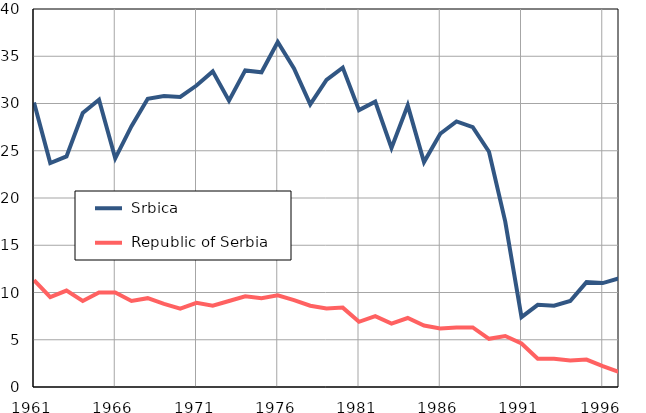
| Category |  Srbica |  Republic of Serbia |
|---|---|---|
| 1961.0 | 30.1 | 11.3 |
| 1962.0 | 23.7 | 9.5 |
| 1963.0 | 24.4 | 10.2 |
| 1964.0 | 29 | 9.1 |
| 1965.0 | 30.4 | 10 |
| 1966.0 | 24.2 | 10 |
| 1967.0 | 27.6 | 9.1 |
| 1968.0 | 30.5 | 9.4 |
| 1969.0 | 30.8 | 8.8 |
| 1970.0 | 30.7 | 8.3 |
| 1971.0 | 31.9 | 8.9 |
| 1972.0 | 33.4 | 8.6 |
| 1973.0 | 30.3 | 9.1 |
| 1974.0 | 33.5 | 9.6 |
| 1975.0 | 33.3 | 9.4 |
| 1976.0 | 36.5 | 9.7 |
| 1977.0 | 33.7 | 9.2 |
| 1978.0 | 29.9 | 8.6 |
| 1979.0 | 32.5 | 8.3 |
| 1980.0 | 33.8 | 8.4 |
| 1981.0 | 29.3 | 6.9 |
| 1982.0 | 30.2 | 7.5 |
| 1983.0 | 25.3 | 6.7 |
| 1984.0 | 29.8 | 7.3 |
| 1985.0 | 23.8 | 6.5 |
| 1986.0 | 26.8 | 6.2 |
| 1987.0 | 28.1 | 6.3 |
| 1988.0 | 27.5 | 6.3 |
| 1989.0 | 24.9 | 5.1 |
| 1990.0 | 17.5 | 5.4 |
| 1991.0 | 7.4 | 4.6 |
| 1992.0 | 8.7 | 3 |
| 1993.0 | 8.6 | 3 |
| 1994.0 | 9.1 | 2.8 |
| 1995.0 | 11.1 | 2.9 |
| 1996.0 | 11 | 2.2 |
| 1997.0 | 11.5 | 1.6 |